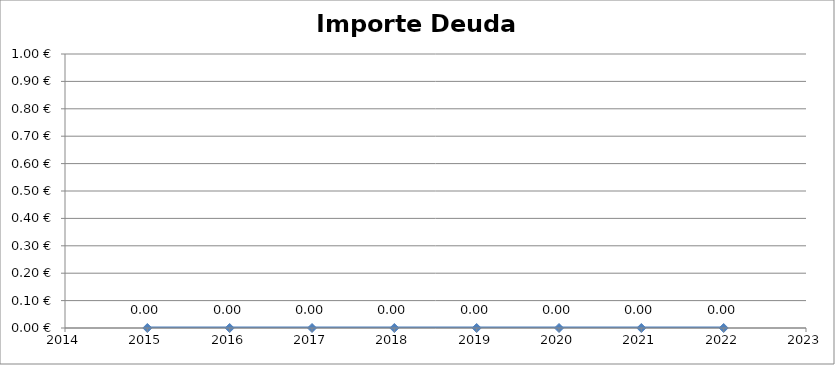
| Category | Importe deuda viva  |
|---|---|
| 2015.0 | 0 |
| 2016.0 | 0 |
| 2017.0 | 0 |
| 2018.0 | 0 |
| 2019.0 | 0 |
| 2020.0 | 0 |
| 2021.0 | 0 |
| 2022.0 | 0 |